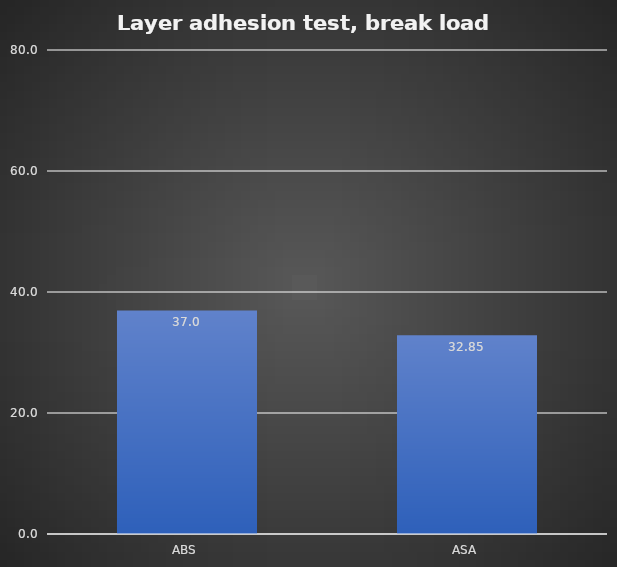
| Category | Average |
|---|---|
| ABS | 36.95 |
| ASA | 32.85 |